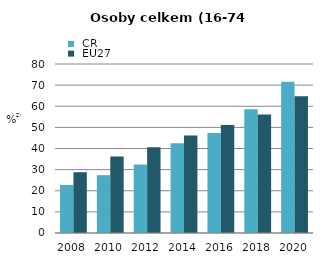
| Category |  ČR |  EU27 |
|---|---|---|
| 2008.0 | 22.738 | 28.779 |
| 2010.0 | 27.362 | 36.179 |
| 2012.0 | 32.464 | 40.536 |
| 2014.0 | 42.509 | 46.199 |
| 2016.0 | 47.376 | 51.16 |
| 2018.0 | 58.592 | 56.139 |
| 2020.0 | 71.64 | 64.736 |